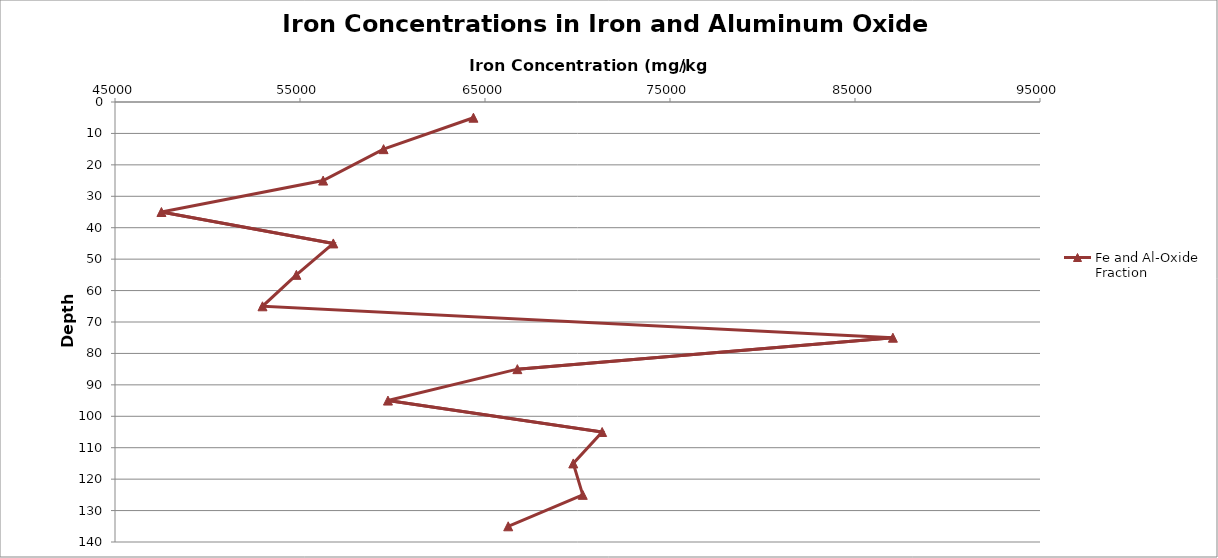
| Category | Fe and Al-Oxide Fraction |
|---|---|
| 64374.34269644138 | 5 |
| 59516.960363720835 | 15 |
| 56250.554859214484 | 25 |
| 47509.90489000312 | 35 |
| 56801.36491983478 | 45 |
| 54804.48996253686 | 55 |
| 52972.26550281308 | 65 |
| 87048.82126567884 | 75 |
| 66749.77716130445 | 85 |
| 59755.043614264374 | 95 |
| 71332.53216935464 | 105 |
| 69771.43426869655 | 115 |
| 70283.82411506014 | 125 |
| 66254.65795400036 | 135 |